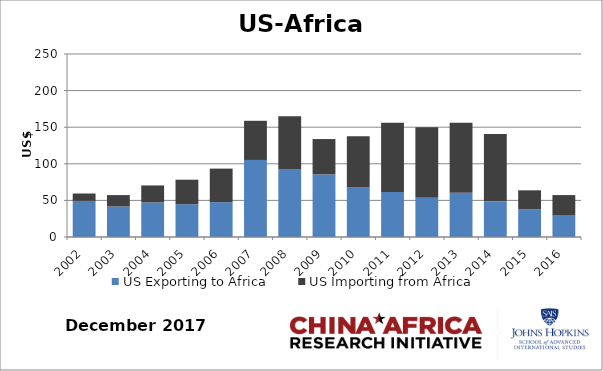
| Category | US Exporting to Africa | US Importing from Africa |
|---|---|---|
| 2002.0 | 49.343 | 10.079 |
| 2003.0 | 41.685 | 15.566 |
| 2004.0 | 47.297 | 23.149 |
| 2005.0 | 44.704 | 33.577 |
| 2006.0 | 47.584 | 45.843 |
| 2007.0 | 105.241 | 53.516 |
| 2008.0 | 92.884 | 72.068 |
| 2009.0 | 85.481 | 48.342 |
| 2010.0 | 67.565 | 70.041 |
| 2011.0 | 61.598 | 94.573 |
| 2012.0 | 53.478 | 96.572 |
| 2013.0 | 60.526 | 95.698 |
| 2014.0 | 48.699 | 92.148 |
| 2015.0 | 37.835 | 25.928 |
| 2016.0 | 30.06 | 27.207 |